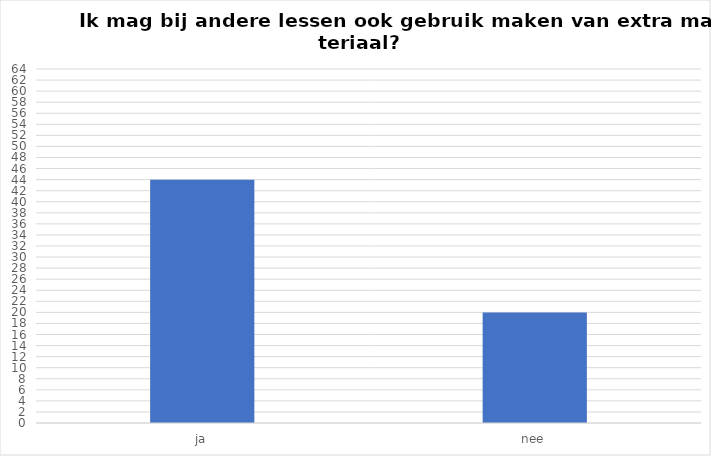
| Category | Series 0 |
|---|---|
| ja | 44 |
| nee | 20 |